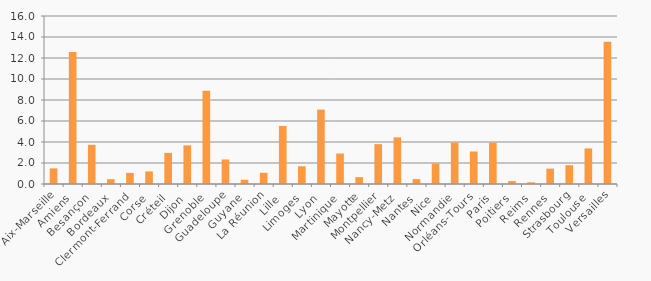
| Category | Pourcentage du nombre de sollicitations (%) |
|---|---|
| Aix-Marseille | 1.49 |
| Amiens | 12.582 |
| Besançon | 3.734 |
| Bordeaux | 0.458 |
| Clermont-Ferrand | 1.057 |
| Corse | 1.199 |
| Créteil | 2.964 |
| Dijon | 3.68 |
| Grenoble | 8.873 |
| Guadeloupe | 2.336 |
| Guyane | 0.404 |
| La Réunion | 1.067 |
| Lille | 5.53 |
| Limoges | 1.692 |
| Lyon | 7.086 |
| Martinique | 2.904 |
| Mayotte | 0.653 |
| Montpellier | 3.797 |
| Nancy-Metz | 4.441 |
| Nantes | 0.47 |
| Nice | 1.951 |
| Normandie | 3.949 |
| Orléans-Tours | 3.096 |
| Paris | 3.946 |
| Poitiers | 0.281 |
| Reims | 0.164 |
| Rennes | 1.465 |
| Strasbourg | 1.793 |
| Toulouse | 3.39 |
| Versailles | 13.548 |